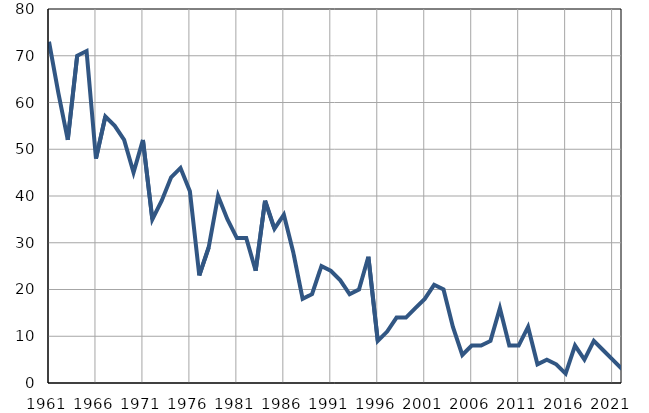
| Category | Умрла 
одојчад |
|---|---|
| 1961.0 | 73 |
| 1962.0 | 62 |
| 1963.0 | 52 |
| 1964.0 | 70 |
| 1965.0 | 71 |
| 1966.0 | 48 |
| 1967.0 | 57 |
| 1968.0 | 55 |
| 1969.0 | 52 |
| 1970.0 | 45 |
| 1971.0 | 52 |
| 1972.0 | 35 |
| 1973.0 | 39 |
| 1974.0 | 44 |
| 1975.0 | 46 |
| 1976.0 | 41 |
| 1977.0 | 23 |
| 1978.0 | 29 |
| 1979.0 | 40 |
| 1980.0 | 35 |
| 1981.0 | 31 |
| 1982.0 | 31 |
| 1983.0 | 24 |
| 1984.0 | 39 |
| 1985.0 | 33 |
| 1986.0 | 36 |
| 1987.0 | 28 |
| 1988.0 | 18 |
| 1989.0 | 19 |
| 1990.0 | 25 |
| 1991.0 | 24 |
| 1992.0 | 22 |
| 1993.0 | 19 |
| 1994.0 | 20 |
| 1995.0 | 27 |
| 1996.0 | 9 |
| 1997.0 | 11 |
| 1998.0 | 14 |
| 1999.0 | 14 |
| 2000.0 | 16 |
| 2001.0 | 18 |
| 2002.0 | 21 |
| 2003.0 | 20 |
| 2004.0 | 12 |
| 2005.0 | 6 |
| 2006.0 | 8 |
| 2007.0 | 8 |
| 2008.0 | 9 |
| 2009.0 | 16 |
| 2010.0 | 8 |
| 2011.0 | 8 |
| 2012.0 | 12 |
| 2013.0 | 4 |
| 2014.0 | 5 |
| 2015.0 | 4 |
| 2016.0 | 2 |
| 2017.0 | 8 |
| 2018.0 | 5 |
| 2019.0 | 9 |
| 2020.0 | 7 |
| 2021.0 | 5 |
| 2022.0 | 3 |